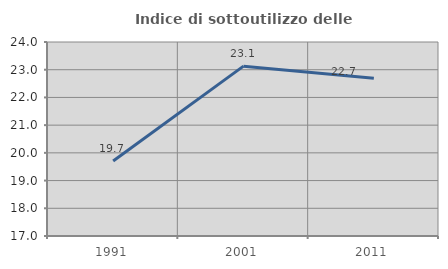
| Category | Indice di sottoutilizzo delle abitazioni  |
|---|---|
| 1991.0 | 19.708 |
| 2001.0 | 23.129 |
| 2011.0 | 22.695 |